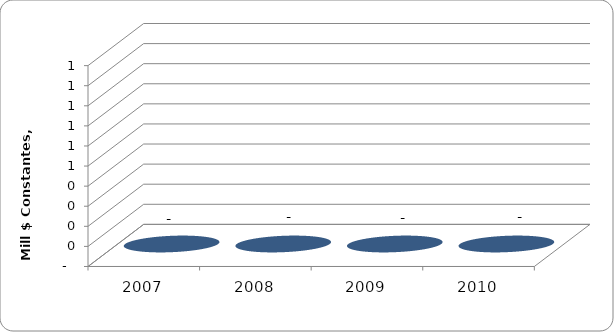
| Category | SALDO DE DEUDA |
|---|---|
| 2007 | 0 |
| 2008 | 0 |
| 2009 | 0 |
| 2010 | 0 |